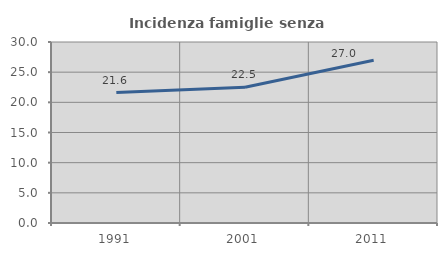
| Category | Incidenza famiglie senza nuclei |
|---|---|
| 1991.0 | 21.629 |
| 2001.0 | 22.504 |
| 2011.0 | 26.978 |